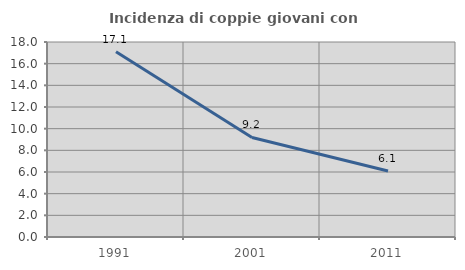
| Category | Incidenza di coppie giovani con figli |
|---|---|
| 1991.0 | 17.107 |
| 2001.0 | 9.187 |
| 2011.0 | 6.098 |